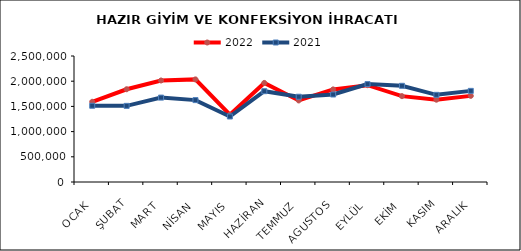
| Category | 2022 | 2021 |
|---|---|---|
| OCAK | 1591573.237 | 1512747.122 |
| ŞUBAT | 1840360.069 | 1510486.298 |
| MART | 2014153.573 | 1674594.299 |
| NİSAN | 2035748.227 | 1625071.172 |
| MAYIS | 1335958.752 | 1299821.611 |
| HAZİRAN | 1965792.716 | 1801807.971 |
| TEMMUZ | 1617780.584 | 1691560.126 |
| AGUSTOS | 1837214.472 | 1736087.389 |
| EYLÜL | 1921224.621 | 1942284.164 |
| EKİM | 1703523.471 | 1908618.804 |
| KASIM | 1633132.723 | 1729425.553 |
| ARALIK | 1709021.855 | 1808065.496 |